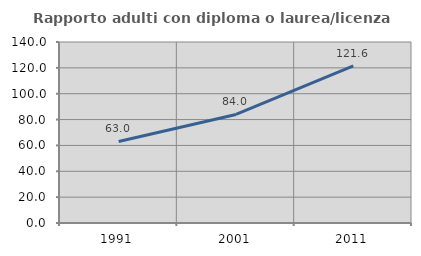
| Category | Rapporto adulti con diploma o laurea/licenza media  |
|---|---|
| 1991.0 | 63.043 |
| 2001.0 | 83.969 |
| 2011.0 | 121.6 |